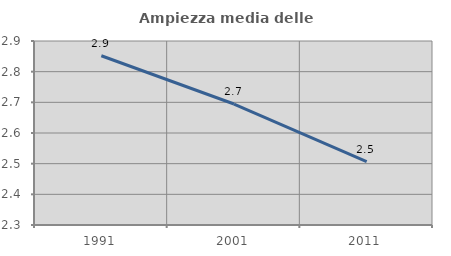
| Category | Ampiezza media delle famiglie |
|---|---|
| 1991.0 | 2.852 |
| 2001.0 | 2.695 |
| 2011.0 | 2.506 |